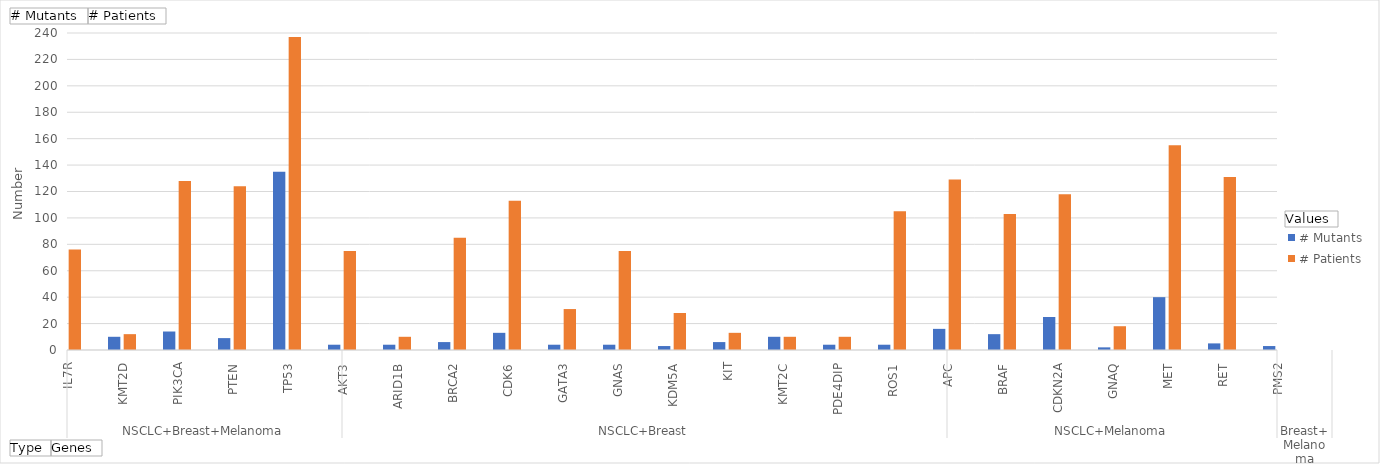
| Category | # Mutants | # Patients |
|---|---|---|
| 0 | 8 | 76 |
| 1 | 10 | 12 |
| 2 | 14 | 128 |
| 3 | 9 | 124 |
| 4 | 135 | 237 |
| 5 | 4 | 75 |
| 6 | 4 | 10 |
| 7 | 6 | 85 |
| 8 | 13 | 113 |
| 9 | 4 | 31 |
| 10 | 4 | 75 |
| 11 | 3 | 28 |
| 12 | 6 | 13 |
| 13 | 10 | 10 |
| 14 | 4 | 10 |
| 15 | 4 | 105 |
| 16 | 16 | 129 |
| 17 | 12 | 103 |
| 18 | 25 | 118 |
| 19 | 2 | 18 |
| 20 | 40 | 155 |
| 21 | 5 | 131 |
| 22 | 3 | 3 |